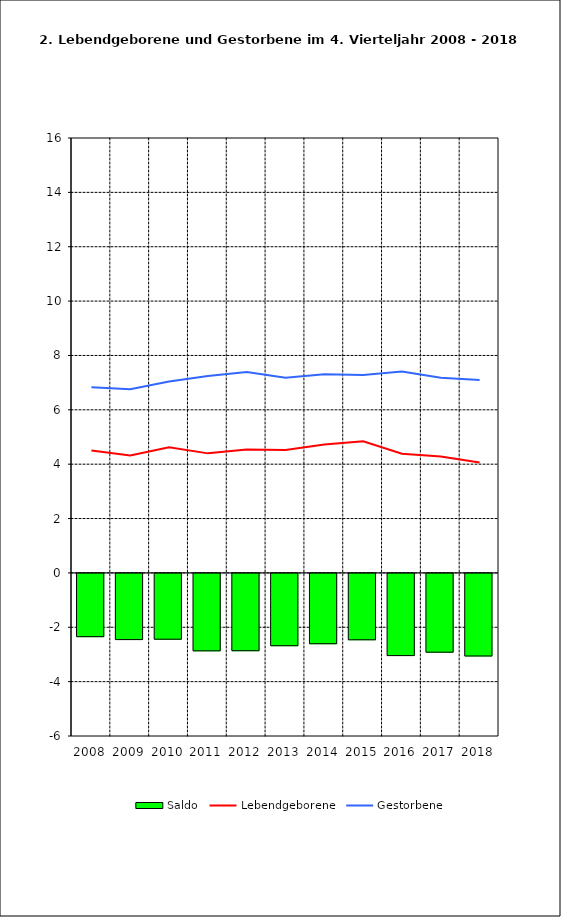
| Category | Saldo |
|---|---|
| 2005.0 | -2.326 |
| 2006.0 | -2.435 |
| 2007.0 | -2.421 |
| 2008.0 | -2.849 |
| 2009.0 | -2.844 |
| 2010.0 | -2.66 |
| 2011.0 | -2.587 |
| 2012.0 | -2.442 |
| 2013.0 | -3.024 |
| 2014.0 | -2.898 |
| 2015.0 | -3.038 |